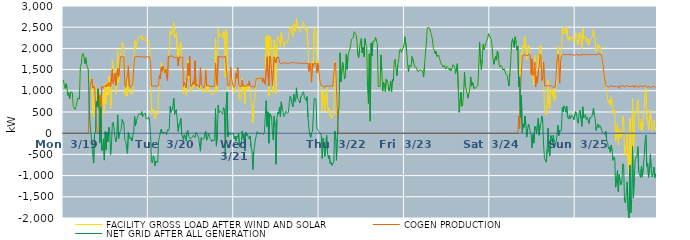
| Category | FACILITY GROSS LOAD AFTER WIND AND SOLAR | COGEN PRODUCTION | NET GRID AFTER ALL GENERATION |
|---|---|---|---|
|  Mon  3/19 | 1256 | 0 | 1256 |
|  Mon  3/19 | 1124 | 0 | 1124 |
|  Mon  3/19 | 1053 | 0 | 1053 |
|  Mon  3/19 | 1166 | 0 | 1166 |
|  Mon  3/19 | 1063 | 0 | 1063 |
|  Mon  3/19 | 888 | 0 | 888 |
|  Mon  3/19 | 953 | 0 | 953 |
|  Mon  3/19 | 809 | 0 | 809 |
|  Mon  3/19 | 972 | 0 | 972 |
|  Mon  3/19 | 985 | 0 | 985 |
|  Mon  3/19 | 957 | 0 | 957 |
|  Mon  3/19 | 629 | 0 | 629 |
|  Mon  3/19 | 633 | 0 | 633 |
|  Mon  3/19 | 563 | 0 | 563 |
|  Mon  3/19 | 611 | 0 | 611 |
|  Mon  3/19 | 631 | 0 | 631 |
|  Mon  3/19 | 828 | 0 | 828 |
|  Mon  3/19 | 844 | 0 | 844 |
|  Mon  3/19 | 803 | 0 | 803 |
|  Mon  3/19 | 1571 | 0 | 1571 |
|  Mon  3/19 | 1635 | 0 | 1635 |
|  Mon  3/19 | 1829 | 0 | 1829 |
|  Mon  3/19 | 1881 | 0 | 1881 |
|  Mon  3/19 | 1801 | 0 | 1801 |
|  Mon  3/19 | 1640 | 0 | 1640 |
|  Mon  3/19 | 1780 | 0 | 1780 |
|  Mon  3/19 | 1634 | 0 | 1634 |
|  Mon  3/19 | 1633 | 0 | 1633 |
|  Mon  3/19 | 1491 | 0 | 1491 |
|  Mon  3/19 | 1298 | 758 | 540 |
|  Mon  3/19 | 1260 | 1064 | 196 |
|  Mon  3/19 | 1214 | 1220 | -6 |
|  Mon  3/19 | 1288 | 1281 | 7 |
|  Mon  3/19 | 553 | 1070 | -517 |
|  Mon  3/19 | 381 | 1087 | -706 |
|  Mon  3/19 | 1092 | 1109 | -17 |
|  Mon  3/19 | 1128 | 1106 | 22 |
|  Mon  3/19 | 966 | 218 | 748 |
|  Mon  3/19 | 620 | 0 | 620 |
|  Mon  3/19 | 1048 | 0 | 1048 |
|  Mon  3/19 | 583 | 0 | 583 |
|  Mon  3/19 | 662 | 895 | -233 |
|  Mon  3/19 | 609 | 0 | 609 |
|  Mon  3/19 | 692 | 1108 | -416 |
|  Mon  3/19 | 736 | 1074 | -338 |
|  Mon  3/19 | 957 | 1091 | -134 |
|  Mon  3/19 | 465 | 1099 | -634 |
|  Mon  3/19 | 1170 | 1133 | 37 |
|  Mon  3/19 | 698 | 1088 | -390 |
|  Mon  3/19 | 1189 | 1166 | 23 |
|  Mon  3/19 | 897 | 1102 | -205 |
|  Mon  3/19 | 1340 | 1197 | 143 |
|  Mon  3/19 | 1229 | 1163 | 66 |
|  Mon  3/19 | 585 | 1091 | -506 |
|  Mon  3/19 | 820 | 1093 | -273 |
|  Mon  3/19 | 1727 | 1498 | 229 |
|  Mon  3/19 | 1424 | 1165 | 259 |
|  Mon  3/19 | 1507 | 1271 | 236 |
|  Mon  3/19 | 1316 | 1421 | -105 |
|  Mon  3/19 | 921 | 1127 | -206 |
|  Mon  3/19 | 1032 | 1108 | -76 |
|  Mon  3/19 | 1963 | 1529 | 434 |
|  Mon  3/19 | 1189 | 1327 | -138 |
|  Mon  3/19 | 1506 | 1500 | 6 |
|  Mon  3/19 | 1842 | 1801 | 41 |
|  Mon  3/19 | 1887 | 1794 | 93 |
|  Mon  3/19 | 2133 | 1809 | 324 |
|  Mon  3/19 | 2138 | 1805 | 333 |
|  Mon  3/19 | 2016 | 1799 | 217 |
|  Mon  3/19 | 964 | 1123 | -159 |
|  Mon  3/19 | 888 | 1082 | -194 |
|  Mon  3/19 | 1071 | 1261 | -190 |
|  Mon  3/19 | 869 | 1344 | -475 |
|  Mon  3/19 | 1605 | 1589 | 16 |
|  Mon  3/19 | 1060 | 1106 | -46 |
|  Mon  3/19 | 935 | 1077 | -142 |
|  Mon  3/19 | 990 | 1092 | -102 |
|  Mon  3/19 | 920 | 1108 | -188 |
|  Mon  3/19 | 1134 | 1191 | -57 |
|  Mon  3/19 | 1557 | 1524 | 33 |
|  Mon  3/19 | 2197 | 1797 | 400 |
|  Mon  3/19 | 1979 | 1804 | 175 |
|  Mon  3/19 | 2101 | 1807 | 294 |
|  Mon  3/19 | 2163 | 1806 | 357 |
|  Mon  3/19 | 2220 | 1807 | 413 |
|  Mon  3/19 | 2282 | 1815 | 467 |
|  Mon  3/19 | 2286 | 1814 | 472 |
|  Mon  3/19 | 2243 | 1810 | 433 |
|  Mon  3/19 | 2307 | 1798 | 509 |
|  Mon  3/19 | 2194 | 1805 | 389 |
|  Mon  3/19 | 2244 | 1798 | 446 |
|  Mon  3/19 | 2262 | 1795 | 467 |
|  Mon  3/19 | 2259 | 1785 | 474 |
|  Mon  3/19 | 2156 | 1814 | 342 |
|  Mon  3/19 | 2130 | 1793 | 337 |
|  Mon  3/19 | 2143 | 1800 | 343 |
|  Tue  3/20 | 2185 | 1799 | 386 |
|  Tue  3/20 | 2070 | 1800 | 270 |
|  Tue  3/20 | 1594 | 1651 | -57 |
|  Tue  3/20 | 433 | 1108 | -675 |
|  Tue  3/20 | 417 | 1116 | -699 |
|  Tue  3/20 | 577 | 1113 | -536 |
|  Tue  3/20 | 535 | 1122 | -587 |
|  Tue  3/20 | 342 | 1113 | -771 |
|  Tue  3/20 | 440 | 1099 | -659 |
|  Tue  3/20 | 467 | 1110 | -643 |
|  Tue  3/20 | 433 | 1125 | -692 |
|  Tue  3/20 | 964 | 1122 | -158 |
|  Tue  3/20 | 1269 | 1369 | -100 |
|  Tue  3/20 | 1310 | 1283 | 27 |
|  Tue  3/20 | 1662 | 1562 | 100 |
|  Tue  3/20 | 1465 | 1462 | 3 |
|  Tue  3/20 | 1574 | 1578 | -4 |
|  Tue  3/20 | 1528 | 1512 | 16 |
|  Tue  3/20 | 1457 | 1425 | 32 |
|  Tue  3/20 | 1518 | 1508 | 10 |
|  Tue  3/20 | 1475 | 1515 | -40 |
|  Tue  3/20 | 1325 | 1242 | 83 |
|  Tue  3/20 | 1873 | 1822 | 51 |
|  Tue  3/20 | 1900 | 1796 | 104 |
|  Tue  3/20 | 2433 | 1802 | 631 |
|  Tue  3/20 | 2312 | 1821 | 491 |
|  Tue  3/20 | 2367 | 1800 | 567 |
|  Tue  3/20 | 2441 | 1816 | 625 |
|  Tue  3/20 | 2616 | 1787 | 829 |
|  Tue  3/20 | 2236 | 1791 | 445 |
|  Tue  3/20 | 2311 | 1783 | 528 |
|  Tue  3/20 | 2357 | 1798 | 559 |
|  Tue  3/20 | 2357 | 1798 | 559 |
|  Tue  3/20 | 1625 | 1582 | 43 |
|  Tue  3/20 | 2006 | 1794 | 212 |
|  Tue  3/20 | 2058 | 1815 | 243 |
|  Tue  3/20 | 2151 | 1801 | 350 |
|  Tue  3/20 | 1744 | 1769 | -25 |
|  Tue  3/20 | 1769 | 1803 | -34 |
|  Tue  3/20 | 940 | 1095 | -155 |
|  Tue  3/20 | 1158 | 1195 | -37 |
|  Tue  3/20 | 1076 | 1137 | -61 |
|  Tue  3/20 | 891 | 1074 | -183 |
|  Tue  3/20 | 1329 | 1304 | 25 |
|  Tue  3/20 | 1719 | 1649 | 70 |
|  Tue  3/20 | 1275 | 1354 | -79 |
|  Tue  3/20 | 1690 | 1811 | -121 |
|  Tue  3/20 | 1017 | 1122 | -105 |
|  Tue  3/20 | 971 | 1090 | -119 |
|  Tue  3/20 | 955 | 1072 | -117 |
|  Tue  3/20 | 1180 | 1226 | -46 |
|  Tue  3/20 | 1105 | 1148 | -43 |
|  Tue  3/20 | 1601 | 1708 | -107 |
|  Tue  3/20 | 1128 | 1112 | 16 |
|  Tue  3/20 | 1166 | 1160 | 6 |
|  Tue  3/20 | 1069 | 1116 | -47 |
|  Tue  3/20 | 1015 | 1111 | -96 |
|  Tue  3/20 | 1009 | 1082 | -73 |
|  Tue  3/20 | 1119 | 1544 | -425 |
|  Tue  3/20 | 1045 | 1147 | -102 |
|  Tue  3/20 | 1013 | 1108 | -95 |
|  Tue  3/20 | 947 | 1097 | -150 |
|  Tue  3/20 | 945 | 1069 | -124 |
|  Tue  3/20 | 1130 | 1145 | -15 |
|  Tue  3/20 | 1525 | 1479 | 46 |
|  Tue  3/20 | 947 | 1115 | -168 |
|  Tue  3/20 | 966 | 1094 | -128 |
|  Tue  3/20 | 1137 | 1139 | -2 |
|  Tue  3/20 | 1029 | 1097 | -68 |
|  Tue  3/20 | 971 | 1098 | -127 |
|  Tue  3/20 | 950 | 1107 | -157 |
|  Tue  3/20 | 911 | 1110 | -199 |
|  Tue  3/20 | 951 | 1104 | -153 |
|  Tue  3/20 | 925 | 1108 | -183 |
|  Tue  3/20 | 949 | 1099 | -150 |
|  Tue  3/20 | 2241 | 1658 | 583 |
|  Tue  3/20 | 966 | 1272 | -306 |
|  Tue  3/20 | 1082 | 1123 | -41 |
|  Tue  3/20 | 2468 | 1809 | 659 |
|  Tue  3/20 | 2283 | 1805 | 478 |
|  Tue  3/20 | 2302 | 1804 | 498 |
|  Tue  3/20 | 2334 | 1814 | 520 |
|  Tue  3/20 | 2285 | 1799 | 486 |
|  Tue  3/20 | 2231 | 1784 | 447 |
|  Tue  3/20 | 2402 | 1800 | 602 |
|  Tue  3/20 | 2350 | 1809 | 541 |
|  Tue  3/20 | 1326 | 1813 | -487 |
|  Tue  3/20 | 2447 | 1793 | 654 |
|  Tue  3/20 | 2318 | 1346 | 972 |
|  Tue  3/20 | 1027 | 1110 | -83 |
|  Tue  3/20 | 1136 | 1110 | 26 |
|  Tue  3/20 | 1098 | 1125 | -27 |
|  Tue  3/20 | 1532 | 1560 | -28 |
|  Tue  3/20 | 1294 | 1308 | -14 |
|  Tue  3/20 | 1157 | 1179 | -22 |
|  Tue  3/20 | 1166 | 1176 | -10 |
|  Wed  3/21 | 949 | 1082 | -133 |
|  Wed  3/21 | 1043 | 1111 | -68 |
|  Wed  3/21 | 1235 | 1414 | -179 |
|  Wed  3/21 | 1223 | 1294 | -71 |
|  Wed  3/21 | 1451 | 1553 | -102 |
|  Wed  3/21 | 1166 | 1162 | 4 |
|  Wed  3/21 | 778 | 1103 | -325 |
|  Wed  3/21 | 796 | 1099 | -303 |
|  Wed  3/21 | 842 | 1102 | -260 |
|  Wed  3/21 | 1301 | 1248 | 53 |
|  Wed  3/21 | 980 | 1104 | -124 |
|  Wed  3/21 | 1103 | 1130 | -27 |
|  Wed  3/21 | 682 | 1101 | -419 |
|  Wed  3/21 | 1120 | 1099 | 21 |
|  Wed  3/21 | 1055 | 1108 | -53 |
|  Wed  3/21 | 1142 | 1161 | -19 |
|  Wed  3/21 | 1018 | 1123 | -105 |
|  Wed  3/21 | 1096 | 1235 | -139 |
|  Wed  3/21 | 1051 | 1117 | -66 |
|  Wed  3/21 | 769 | 1096 | -327 |
|  Wed  3/21 | 695 | 1095 | -400 |
|  Wed  3/21 | 240 | 1093 | -853 |
|  Wed  3/21 | 654 | 1100 | -446 |
|  Wed  3/21 | 788 | 1073 | -285 |
|  Wed  3/21 | 1041 | 1172 | -131 |
|  Wed  3/21 | 1248 | 1298 | -50 |
|  Wed  3/21 | 1326 | 1288 | 38 |
|  Wed  3/21 | 1293 | 1289 | 4 |
|  Wed  3/21 | 1304 | 1308 | -4 |
|  Wed  3/21 | 1293 | 1303 | -10 |
|  Wed  3/21 | 1285 | 1278 | 7 |
|  Wed  3/21 | 1303 | 1310 | -7 |
|  Wed  3/21 | 1194 | 1194 | 0 |
|  Wed  3/21 | 1271 | 1298 | -27 |
|  Wed  3/21 | 1237 | 1206 | 31 |
|  Wed  3/21 | 1173 | 1150 | 23 |
|  Wed  3/21 | 2285 | 1518 | 767 |
|  Wed  3/21 | 1958 | 1802 | 156 |
|  Wed  3/21 | 2306 | 1800 | 506 |
|  Wed  3/21 | 876 | 1112 | -236 |
|  Wed  3/21 | 2285 | 1821 | 464 |
|  Wed  3/21 | 2244 | 1794 | 450 |
|  Wed  3/21 | 2182 | 1806 | 376 |
|  Wed  3/21 | 1142 | 1122 | 20 |
|  Wed  3/21 | 945 | 1107 | -162 |
|  Wed  3/21 | 2201 | 1800 | 401 |
|  Wed  3/21 | 1974 | 1807 | 167 |
|  Wed  3/21 | 929 | 1663 | -734 |
|  Wed  3/21 | 2106 | 1785 | 321 |
|  Wed  3/21 | 2290 | 1795 | 495 |
|  Wed  3/21 | 2246 | 1796 | 450 |
|  Wed  3/21 | 2269 | 1662 | 607 |
|  Wed  3/21 | 2042 | 1657 | 385 |
|  Wed  3/21 | 2374 | 1633 | 741 |
|  Wed  3/21 | 2224 | 1649 | 575 |
|  Wed  3/21 | 2154 | 1659 | 495 |
|  Wed  3/21 | 2039 | 1643 | 396 |
|  Wed  3/21 | 2098 | 1659 | 439 |
|  Wed  3/21 | 2167 | 1648 | 519 |
|  Wed  3/21 | 2171 | 1655 | 516 |
|  Wed  3/21 | 2122 | 1656 | 466 |
|  Wed  3/21 | 2133 | 1641 | 492 |
|  Wed  3/21 | 2386 | 1658 | 728 |
|  Wed  3/21 | 2527 | 1659 | 868 |
|  Wed  3/21 | 2453 | 1646 | 807 |
|  Wed  3/21 | 2372 | 1665 | 707 |
|  Wed  3/21 | 2281 | 1659 | 622 |
|  Wed  3/21 | 2590 | 1667 | 923 |
|  Wed  3/21 | 2426 | 1658 | 768 |
|  Wed  3/21 | 2393 | 1659 | 734 |
|  Wed  3/21 | 2715 | 1645 | 1070 |
|  Wed  3/21 | 2485 | 1651 | 834 |
|  Wed  3/21 | 2493 | 1663 | 830 |
|  Wed  3/21 | 2433 | 1662 | 771 |
|  Wed  3/21 | 2383 | 1669 | 714 |
|  Wed  3/21 | 2496 | 1637 | 859 |
|  Wed  3/21 | 2535 | 1652 | 883 |
|  Wed  3/21 | 2590 | 1646 | 944 |
|  Wed  3/21 | 2635 | 1658 | 977 |
|  Wed  3/21 | 2501 | 1652 | 849 |
|  Wed  3/21 | 2513 | 1658 | 855 |
|  Wed  3/21 | 2407 | 1641 | 766 |
|  Wed  3/21 | 2495 | 1632 | 863 |
|  Wed  3/21 | 2032 | 1653 | 379 |
|  Wed  3/21 | 1587 | 1459 | 128 |
|  Wed  3/21 | 1618 | 1655 | -37 |
|  Wed  3/21 | 1424 | 1525 | -101 |
|  Wed  3/21 | 1216 | 1202 | 14 |
|  Wed  3/21 | 1696 | 1655 | 41 |
|  Wed  3/21 | 1618 | 1576 | 42 |
|  Wed  3/21 | 2471 | 1653 | 818 |
|  Wed  3/21 | 2462 | 1647 | 815 |
|  Wed  3/21 | 2456 | 1651 | 805 |
|  Wed  3/21 | 1549 | 1427 | 122 |
|  Wed  3/21 | 1724 | 1651 | 73 |
|  Wed  3/21 | 1544 | 1501 | 43 |
|  Thu  3/22 | 1356 | 1322 | 34 |
|  Thu  3/22 | 1151 | 1152 | -1 |
|  Thu  3/22 | 1061 | 1113 | -52 |
|  Thu  3/22 | 515 | 1110 | -595 |
|  Thu  3/22 | 997 | 1115 | -118 |
|  Thu  3/22 | 781 | 1111 | -330 |
|  Thu  3/22 | 533 | 1079 | -546 |
|  Thu  3/22 | 555 | 1113 | -558 |
|  Thu  3/22 | 1070 | 1118 | -48 |
|  Thu  3/22 | 644 | 1111 | -467 |
|  Thu  3/22 | 501 | 1100 | -599 |
|  Thu  3/22 | 585 | 1109 | -524 |
|  Thu  3/22 | 387 | 1103 | -716 |
|  Thu  3/22 | 434 | 1115 | -681 |
|  Thu  3/22 | 348 | 1113 | -765 |
|  Thu  3/22 | 348 | 1105 | -757 |
|  Thu  3/22 | 439 | 1113 | -674 |
|  Thu  3/22 | 1699 | 1644 | 55 |
|  Thu  3/22 | 1671 | 1671 | 0 |
|  Thu  3/22 | 441 | 1081 | -640 |
|  Thu  3/22 | 432 | 552 | -120 |
|  Thu  3/22 | 435 | 0 | 435 |
|  Thu  3/22 | 656 | 0 | 656 |
|  Thu  3/22 | 1898 | 0 | 1898 |
|  Thu  3/22 | 1211 | 0 | 1211 |
|  Thu  3/22 | 1231 | 0 | 1231 |
|  Thu  3/22 | 1669 | 0 | 1669 |
|  Thu  3/22 | 1528 | 0 | 1528 |
|  Thu  3/22 | 1276 | 0 | 1276 |
|  Thu  3/22 | 1351 | 0 | 1351 |
|  Thu  3/22 | 1862 | 0 | 1862 |
|  Thu  3/22 | 1505 | 0 | 1505 |
|  Thu  3/22 | 1811 | 0 | 1811 |
|  Thu  3/22 | 1909 | 0 | 1909 |
|  Thu  3/22 | 1972 | 0 | 1972 |
|  Thu  3/22 | 2079 | 0 | 2079 |
|  Thu  3/22 | 2214 | 0 | 2214 |
|  Thu  3/22 | 2234 | 0 | 2234 |
|  Thu  3/22 | 2265 | 0 | 2265 |
|  Thu  3/22 | 2394 | 0 | 2394 |
|  Thu  3/22 | 2359 | 0 | 2359 |
|  Thu  3/22 | 2330 | 0 | 2330 |
|  Thu  3/22 | 2196 | 0 | 2196 |
|  Thu  3/22 | 1838 | 0 | 1838 |
|  Thu  3/22 | 1777 | 0 | 1777 |
|  Thu  3/22 | 1981 | 0 | 1981 |
|  Thu  3/22 | 2148 | 0 | 2148 |
|  Thu  3/22 | 2235 | 0 | 2235 |
|  Thu  3/22 | 1892 | 0 | 1892 |
|  Thu  3/22 | 2029 | 0 | 2029 |
|  Thu  3/22 | 1804 | 0 | 1804 |
|  Thu  3/22 | 2229 | 0 | 2229 |
|  Thu  3/22 | 2107 | 0 | 2107 |
|  Thu  3/22 | 2042 | 0 | 2042 |
|  Thu  3/22 | 1097 | 0 | 1097 |
|  Thu  3/22 | 703 | 0 | 703 |
|  Thu  3/22 | 1874 | 0 | 1874 |
|  Thu  3/22 | 283 | 0 | 283 |
|  Thu  3/22 | 2126 | 0 | 2126 |
|  Thu  3/22 | 1822 | 0 | 1822 |
|  Thu  3/22 | 2165 | 0 | 2165 |
|  Thu  3/22 | 2171 | 0 | 2171 |
|  Thu  3/22 | 2178 | 0 | 2178 |
|  Thu  3/22 | 2255 | 0 | 2255 |
|  Thu  3/22 | 2171 | 0 | 2171 |
|  Thu  3/22 | 2105 | 0 | 2105 |
|  Thu  3/22 | 1099 | 0 | 1099 |
|  Thu  3/22 | 1080 | 0 | 1080 |
|  Thu  3/22 | 1104 | 0 | 1104 |
|  Thu  3/22 | 1850 | 0 | 1850 |
|  Thu  3/22 | 1488 | 0 | 1488 |
|  Thu  3/22 | 991 | 0 | 991 |
|  Thu  3/22 | 1195 | 0 | 1195 |
|  Thu  3/22 | 1130 | 0 | 1130 |
|  Thu  3/22 | 982 | 0 | 982 |
|  Thu  3/22 | 1278 | 0 | 1278 |
|  Thu  3/22 | 1248 | 0 | 1248 |
|  Thu  3/22 | 1172 | 0 | 1172 |
|  Thu  3/22 | 991 | 0 | 991 |
|  Thu  3/22 | 1082 | 0 | 1082 |
|  Thu  3/22 | 1226 | 0 | 1226 |
|  Thu  3/22 | 975 | 0 | 975 |
|  Thu  3/22 | 1266 | 0 | 1266 |
|  Thu  3/22 | 1226 | 0 | 1226 |
|  Thu  3/22 | 1706 | 0 | 1706 |
|  Thu  3/22 | 1745 | 0 | 1745 |
|  Thu  3/22 | 1547 | 0 | 1547 |
|  Thu  3/22 | 1356 | 0 | 1356 |
|  Thu  3/22 | 1605 | 0 | 1605 |
|  Thu  3/22 | 1730 | 0 | 1730 |
|  Thu  3/22 | 1952 | 0 | 1952 |
|  Thu  3/22 | 1991 | 0 | 1991 |
|  Thu  3/22 | 1904 | 0 | 1904 |
|  Thu  3/22 | 1899 | 0 | 1899 |
|  Thu  3/22 | 2013 | 0 | 2013 |
|  Thu  3/22 | 2086 | 0 | 2086 |
|  Fri  3/23 | 2273 | 0 | 2273 |
|  Fri  3/23 | 2259 | 0 | 2259 |
|  Fri  3/23 | 1938 | 0 | 1938 |
|  Fri  3/23 | 1639 | 0 | 1639 |
|  Fri  3/23 | 1449 | 0 | 1449 |
|  Fri  3/23 | 1609 | 0 | 1609 |
|  Fri  3/23 | 1617 | 0 | 1617 |
|  Fri  3/23 | 1569 | 0 | 1569 |
|  Fri  3/23 | 1810 | 0 | 1810 |
|  Fri  3/23 | 1825 | 0 | 1825 |
|  Fri  3/23 | 1655 | 0 | 1655 |
|  Fri  3/23 | 1566 | 0 | 1566 |
|  Fri  3/23 | 1548 | 0 | 1548 |
|  Fri  3/23 | 1548 | 0 | 1548 |
|  Fri  3/23 | 1473 | 0 | 1473 |
|  Fri  3/23 | 1447 | 0 | 1447 |
|  Fri  3/23 | 1485 | 0 | 1485 |
|  Fri  3/23 | 1506 | 0 | 1506 |
|  Fri  3/23 | 1491 | 0 | 1491 |
|  Fri  3/23 | 1485 | 0 | 1485 |
|  Fri  3/23 | 1452 | 0 | 1452 |
|  Fri  3/23 | 1324 | 0 | 1324 |
|  Fri  3/23 | 1576 | 0 | 1576 |
|  Fri  3/23 | 1869 | 0 | 1869 |
|  Fri  3/23 | 2082 | 0 | 2082 |
|  Fri  3/23 | 2459 | 0 | 2459 |
|  Fri  3/23 | 2497 | 0 | 2497 |
|  Fri  3/23 | 2488 | 0 | 2488 |
|  Fri  3/23 | 2471 | 0 | 2471 |
|  Fri  3/23 | 2373 | 0 | 2373 |
|  Fri  3/23 | 2304 | 0 | 2304 |
|  Fri  3/23 | 2198 | 0 | 2198 |
|  Fri  3/23 | 2002 | 0 | 2002 |
|  Fri  3/23 | 1954 | 0 | 1954 |
|  Fri  3/23 | 1868 | 0 | 1868 |
|  Fri  3/23 | 1935 | 0 | 1935 |
|  Fri  3/23 | 1807 | 0 | 1807 |
|  Fri  3/23 | 1788 | 0 | 1788 |
|  Fri  3/23 | 1841 | 0 | 1841 |
|  Fri  3/23 | 1756 | 0 | 1756 |
|  Fri  3/23 | 1680 | 0 | 1680 |
|  Fri  3/23 | 1637 | 0 | 1637 |
|  Fri  3/23 | 1603 | 0 | 1603 |
|  Fri  3/23 | 1557 | 0 | 1557 |
|  Fri  3/23 | 1600 | 0 | 1600 |
|  Fri  3/23 | 1577 | 0 | 1577 |
|  Fri  3/23 | 1509 | 0 | 1509 |
|  Fri  3/23 | 1577 | 0 | 1577 |
|  Fri  3/23 | 1564 | 0 | 1564 |
|  Fri  3/23 | 1539 | 0 | 1539 |
|  Fri  3/23 | 1488 | 0 | 1488 |
|  Fri  3/23 | 1533 | 0 | 1533 |
|  Fri  3/23 | 1465 | 0 | 1465 |
|  Fri  3/23 | 1530 | 0 | 1530 |
|  Fri  3/23 | 1619 | 0 | 1619 |
|  Fri  3/23 | 1638 | 0 | 1638 |
|  Fri  3/23 | 1555 | 0 | 1555 |
|  Fri  3/23 | 1409 | 0 | 1409 |
|  Fri  3/23 | 1409 | 0 | 1409 |
|  Fri  3/23 | 1639 | 0 | 1639 |
|  Fri  3/23 | 1065 | 0 | 1065 |
|  Fri  3/23 | 494 | 0 | 494 |
|  Fri  3/23 | 516 | 0 | 516 |
|  Fri  3/23 | 969 | 0 | 969 |
|  Fri  3/23 | 635 | 0 | 635 |
|  Fri  3/23 | 666 | 0 | 666 |
|  Fri  3/23 | 958 | 0 | 958 |
|  Fri  3/23 | 1434 | 0 | 1434 |
|  Fri  3/23 | 1107 | 0 | 1107 |
|  Fri  3/23 | 1015 | 0 | 1015 |
|  Fri  3/23 | 926 | 0 | 926 |
|  Fri  3/23 | 827 | 0 | 827 |
|  Fri  3/23 | 936 | 0 | 936 |
|  Fri  3/23 | 1047 | 0 | 1047 |
|  Fri  3/23 | 1329 | 0 | 1329 |
|  Fri  3/23 | 1109 | 0 | 1109 |
|  Fri  3/23 | 1207 | 0 | 1207 |
|  Fri  3/23 | 1195 | 0 | 1195 |
|  Fri  3/23 | 1051 | 0 | 1051 |
|  Fri  3/23 | 1053 | 0 | 1053 |
|  Fri  3/23 | 1080 | 0 | 1080 |
|  Fri  3/23 | 1066 | 0 | 1066 |
|  Fri  3/23 | 1118 | 0 | 1118 |
|  Fri  3/23 | 1545 | 0 | 1545 |
|  Fri  3/23 | 2150 | 0 | 2150 |
|  Fri  3/23 | 1704 | 0 | 1704 |
|  Fri  3/23 | 1497 | 0 | 1497 |
|  Fri  3/23 | 1755 | 0 | 1755 |
|  Fri  3/23 | 2101 | 0 | 2101 |
|  Fri  3/23 | 1972 | 0 | 1972 |
|  Fri  3/23 | 2025 | 0 | 2025 |
|  Fri  3/23 | 2128 | 0 | 2128 |
|  Fri  3/23 | 2181 | 0 | 2181 |
|  Fri  3/23 | 2226 | 0 | 2226 |
|  Fri  3/23 | 2349 | 0 | 2349 |
|  Fri  3/23 | 2313 | 0 | 2313 |
|  Sat  3/24 | 2317 | 0 | 2317 |
|  Sat  3/24 | 2214 | 0 | 2214 |
|  Sat  3/24 | 2060 | 0 | 2060 |
|  Sat  3/24 | 1779 | 0 | 1779 |
|  Sat  3/24 | 1624 | 0 | 1624 |
|  Sat  3/24 | 1635 | 0 | 1635 |
|  Sat  3/24 | 1807 | 0 | 1807 |
|  Sat  3/24 | 1723 | 0 | 1723 |
|  Sat  3/24 | 1933 | 0 | 1933 |
|  Sat  3/24 | 1875 | 0 | 1875 |
|  Sat  3/24 | 1590 | 0 | 1590 |
|  Sat  3/24 | 1558 | 0 | 1558 |
|  Sat  3/24 | 1603 | 0 | 1603 |
|  Sat  3/24 | 1574 | 0 | 1574 |
|  Sat  3/24 | 1491 | 0 | 1491 |
|  Sat  3/24 | 1469 | 0 | 1469 |
|  Sat  3/24 | 1518 | 0 | 1518 |
|  Sat  3/24 | 1422 | 0 | 1422 |
|  Sat  3/24 | 1407 | 0 | 1407 |
|  Sat  3/24 | 1355 | 0 | 1355 |
|  Sat  3/24 | 1348 | 0 | 1348 |
|  Sat  3/24 | 1114 | 0 | 1114 |
|  Sat  3/24 | 1400 | 0 | 1400 |
|  Sat  3/24 | 1699 | 0 | 1699 |
|  Sat  3/24 | 2138 | 0 | 2138 |
|  Sat  3/24 | 2227 | 0 | 2227 |
|  Sat  3/24 | 2229 | 0 | 2229 |
|  Sat  3/24 | 2026 | 0 | 2026 |
|  Sat  3/24 | 2274 | 0 | 2274 |
|  Sat  3/24 | 2128 | 0 | 2128 |
|  Sat  3/24 | 1958 | 0 | 1958 |
|  Sat  3/24 | 2052 | 0 | 2052 |
|  Sat  3/24 | 1499 | 408 | 1091 |
|  Sat  3/24 | 1436 | 109 | 1327 |
|  Sat  3/24 | 1387 | 1014 | 373 |
|  Sat  3/24 | 1909 | 1020 | 889 |
|  Sat  3/24 | 1854 | 1840 | 14 |
|  Sat  3/24 | 2075 | 1863 | 212 |
|  Sat  3/24 | 1990 | 1851 | 139 |
|  Sat  3/24 | 2276 | 1871 | 405 |
|  Sat  3/24 | 2056 | 1843 | 213 |
|  Sat  3/24 | 1730 | 1823 | -93 |
|  Sat  3/24 | 1928 | 1823 | 105 |
|  Sat  3/24 | 2076 | 1862 | 214 |
|  Sat  3/24 | 1985 | 1856 | 129 |
|  Sat  3/24 | 1863 | 1850 | 13 |
|  Sat  3/24 | 1367 | 1387 | -20 |
|  Sat  3/24 | 1397 | 1742 | -345 |
|  Sat  3/24 | 1331 | 1361 | -30 |
|  Sat  3/24 | 1153 | 1387 | -234 |
|  Sat  3/24 | 1837 | 1675 | 162 |
|  Sat  3/24 | 1203 | 1088 | 115 |
|  Sat  3/24 | 1331 | 1336 | -5 |
|  Sat  3/24 | 1361 | 1181 | 180 |
|  Sat  3/24 | 1831 | 1479 | 352 |
|  Sat  3/24 | 1510 | 1559 | -49 |
|  Sat  3/24 | 2054 | 1865 | 189 |
|  Sat  3/24 | 2085 | 1841 | 244 |
|  Sat  3/24 | 1645 | 1244 | 401 |
|  Sat  3/24 | 1572 | 1304 | 268 |
|  Sat  3/24 | 1381 | 1671 | -290 |
|  Sat  3/24 | 526 | 1118 | -592 |
|  Sat  3/24 | 507 | 1121 | -614 |
|  Sat  3/24 | 424 | 1107 | -683 |
|  Sat  3/24 | 709 | 1087 | -378 |
|  Sat  3/24 | 1248 | 1124 | 124 |
|  Sat  3/24 | 677 | 1121 | -444 |
|  Sat  3/24 | 584 | 1116 | -532 |
|  Sat  3/24 | 1040 | 1096 | -56 |
|  Sat  3/24 | 1005 | 1114 | -109 |
|  Sat  3/24 | 895 | 1116 | -221 |
|  Sat  3/24 | 1041 | 1085 | -44 |
|  Sat  3/24 | 759 | 1108 | -349 |
|  Sat  3/24 | 821 | 1080 | -259 |
|  Sat  3/24 | 1120 | 1342 | -222 |
|  Sat  3/24 | 1676 | 1720 | -44 |
|  Sat  3/24 | 2045 | 1856 | 189 |
|  Sat  3/24 | 1621 | 1683 | -62 |
|  Sat  3/24 | 1257 | 1182 | 75 |
|  Sat  3/24 | 1707 | 1667 | 40 |
|  Sat  3/24 | 1905 | 1830 | 75 |
|  Sat  3/24 | 2458 | 1854 | 604 |
|  Sat  3/24 | 2348 | 1842 | 506 |
|  Sat  3/24 | 2506 | 1861 | 645 |
|  Sat  3/24 | 2473 | 1867 | 606 |
|  Sat  3/24 | 2341 | 1847 | 494 |
|  Sat  3/24 | 2492 | 1855 | 637 |
|  Sat  3/24 | 2239 | 1857 | 382 |
|  Sat  3/24 | 2174 | 1842 | 332 |
|  Sat  3/24 | 2290 | 1859 | 431 |
|  Sat  3/24 | 2194 | 1853 | 341 |
|  Sat  3/24 | 2270 | 1855 | 415 |
|  Sat  3/24 | 2274 | 1865 | 409 |
|  Sat  3/24 | 2243 | 1845 | 398 |
|  Sat  3/24 | 2171 | 1854 | 317 |
|  Sat  3/24 | 2145 | 1839 | 306 |
|  Sun  3/25 | 2367 | 1857 | 510 |
|  Sun  3/25 | 2336 | 1860 | 476 |
|  Sun  3/25 | 2130 | 1867 | 263 |
|  Sun  3/25 | 2077 | 1845 | 232 |
|  Sun  3/25 | 2337 | 1857 | 480 |
|  Sun  3/25 | 2379 | 1840 | 539 |
|  Sun  3/25 | 2216 | 1865 | 351 |
|  Sun  3/25 | 1996 | 1835 | 161 |
|  Sun  3/25 | 2484 | 1861 | 623 |
|  Sun  3/25 | 2225 | 1866 | 359 |
|  Sun  3/25 | 2226 | 1861 | 365 |
|  Sun  3/25 | 2285 | 1843 | 442 |
|  Sun  3/25 | 2164 | 1843 | 321 |
|  Sun  3/25 | 2230 | 1852 | 378 |
|  Sun  3/25 | 2227 | 1855 | 372 |
|  Sun  3/25 | 2072 | 1842 | 230 |
|  Sun  3/25 | 2211 | 1851 | 360 |
|  Sun  3/25 | 2224 | 1870 | 354 |
|  Sun  3/25 | 2237 | 1855 | 382 |
|  Sun  3/25 | 2285 | 1833 | 452 |
|  Sun  3/25 | 2446 | 1855 | 591 |
|  Sun  3/25 | 2284 | 1859 | 425 |
|  Sun  3/25 | 2200 | 1855 | 345 |
|  Sun  3/25 | 1921 | 1856 | 65 |
|  Sun  3/25 | 2011 | 1841 | 170 |
|  Sun  3/25 | 2097 | 1876 | 221 |
|  Sun  3/25 | 1982 | 1856 | 126 |
|  Sun  3/25 | 2053 | 1866 | 187 |
|  Sun  3/25 | 2008 | 1848 | 160 |
|  Sun  3/25 | 1935 | 1858 | 77 |
|  Sun  3/25 | 1933 | 1837 | 96 |
|  Sun  3/25 | 1578 | 1585 | -7 |
|  Sun  3/25 | 1367 | 1367 | 0 |
|  Sun  3/25 | 1359 | 1383 | -24 |
|  Sun  3/25 | 1180 | 1136 | 44 |
|  Sun  3/25 | 907 | 1103 | -196 |
|  Sun  3/25 | 892 | 1122 | -230 |
|  Sun  3/25 | 722 | 1093 | -371 |
|  Sun  3/25 | 786 | 1114 | -328 |
|  Sun  3/25 | 651 | 1102 | -451 |
|  Sun  3/25 | 841 | 1128 | -287 |
|  Sun  3/25 | 700 | 1111 | -411 |
|  Sun  3/25 | 459 | 1097 | -638 |
|  Sun  3/25 | 558 | 1115 | -557 |
|  Sun  3/25 | 512 | 1103 | -591 |
|  Sun  3/25 | -177 | 1097 | -1274 |
|  Sun  3/25 | 13 | 1100 | -1087 |
|  Sun  3/25 | 229 | 1111 | -882 |
|  Sun  3/25 | -280 | 1099 | -1379 |
|  Sun  3/25 | 81 | 1057 | -976 |
|  Sun  3/25 | -16 | 1119 | -1135 |
|  Sun  3/25 | -108 | 1108 | -1216 |
|  Sun  3/25 | -15 | 1117 | -1132 |
|  Sun  3/25 | 404 | 1126 | -722 |
|  Sun  3/25 | 335 | 1112 | -777 |
|  Sun  3/25 | -520 | 1084 | -1604 |
|  Sun  3/25 | -528 | 1117 | -1645 |
|  Sun  3/25 | -311 | 1104 | -1415 |
|  Sun  3/25 | -23 | 1125 | -1148 |
|  Sun  3/25 | -726 | 1100 | -1826 |
|  Sun  3/25 | -959 | 1082 | -2041 |
|  Sun  3/25 | 351 | 1101 | -750 |
|  Sun  3/25 | -784 | 1095 | -1879 |
|  Sun  3/25 | -470 | 1105 | -1575 |
|  Sun  3/25 | 814 | 1122 | -308 |
|  Sun  3/25 | -404 | 1123 | -1527 |
|  Sun  3/25 | 47 | 1071 | -1024 |
|  Sun  3/25 | 504 | 1128 | -624 |
|  Sun  3/25 | 539 | 1103 | -564 |
|  Sun  3/25 | 586 | 1107 | -521 |
|  Sun  3/25 | 787 | 1105 | -318 |
|  Sun  3/25 | 159 | 1078 | -919 |
|  Sun  3/25 | 135 | 1111 | -976 |
|  Sun  3/25 | 71 | 1120 | -1049 |
|  Sun  3/25 | 323 | 1107 | -784 |
|  Sun  3/25 | 66 | 1100 | -1034 |
|  Sun  3/25 | 267 | 1093 | -826 |
|  Sun  3/25 | 559 | 1132 | -573 |
|  Sun  3/25 | 912 | 1113 | -201 |
|  Sun  3/25 | 1056 | 1103 | -47 |
|  Sun  3/25 | 330 | 1109 | -779 |
|  Sun  3/25 | 359 | 1076 | -717 |
|  Sun  3/25 | 71 | 1114 | -1043 |
|  Sun  3/25 | 252 | 1126 | -874 |
|  Sun  3/25 | 563 | 1063 | -500 |
|  Sun  3/25 | 259 | 1081 | -822 |
|  Sun  3/25 | 68 | 1102 | -1034 |
|  Sun  3/25 | 156 | 1124 | -968 |
|  Sun  3/25 | 308 | 1105 | -797 |
|  Sun  3/25 | 74 | 1121 | -1047 |
|  Sun  3/25 | 123 | 1081 | -958 |
|  Sun  3/25 | 109 | 1104 | -995 |